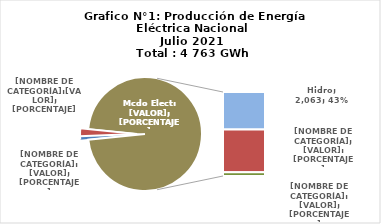
| Category | Series 0 |
|---|---|
| 0 | 45.031 |
| 1 | 107.102 |
| 2 | 2062.843 |
| 3 | 2342.448 |
| 4 | 206.072 |